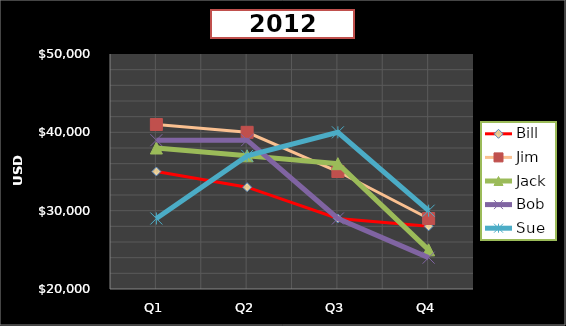
| Category | Bill | Jim | Jack | Bob | Sue |
|---|---|---|---|---|---|
| Q1 | 35000 | 41000 | 38000 | 39000 | 29000 |
| Q2 | 33000 | 40000 | 37000 | 39000 | 37000 |
| Q3 | 29000 | 35000 | 36000 | 29000 | 40000 |
| Q4 | 28000 | 29000 | 25000 | 24000 | 30000 |